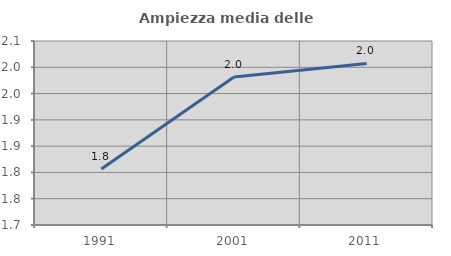
| Category | Ampiezza media delle famiglie |
|---|---|
| 1991.0 | 1.807 |
| 2001.0 | 1.982 |
| 2011.0 | 2.007 |